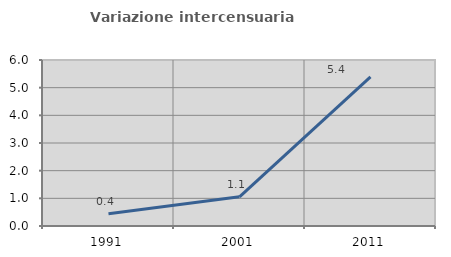
| Category | Variazione intercensuaria annua |
|---|---|
| 1991.0 | 0.444 |
| 2001.0 | 1.055 |
| 2011.0 | 5.394 |